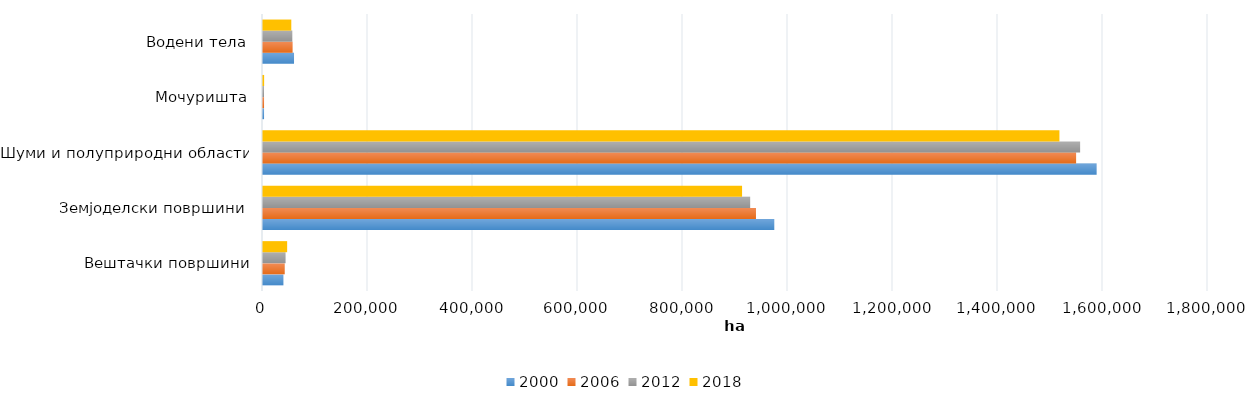
| Category | 2000 | 2006 | 2012 | 2018 |
|---|---|---|---|---|
| Вештачки површини | 38900 | 41400 | 43000 | 45993.23 |
| Земјоделски површини  | 973900 | 939000 | 927976 | 912508.37 |
| Шуми и полуприродни области | 1587900 | 1548800 | 1556448.87 | 1516995.25 |
| Мочуришта | 2000 | 2000 | 1950 | 2153.83 |
| Водени тела | 59100 | 56400 | 55856 | 53905.411 |